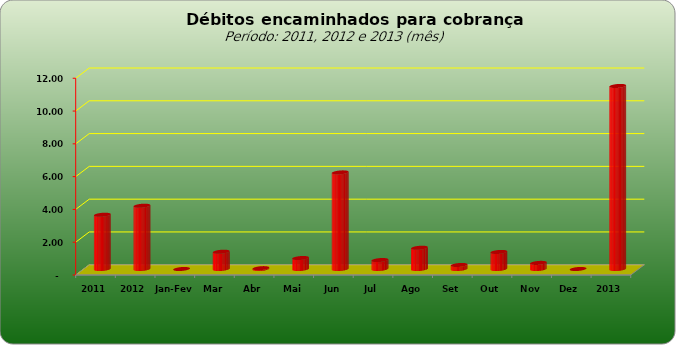
| Category |  3.309.443,02   3.859.728,44   -     1.053.903,71   50.529,60   669.296,13   5.890.806,29   546.448,11   1.296.316,32   245.030,62   1.039.828,93   372.068,71   -     11.164.228,42  |
|---|---|
| 2011 | 3309443.02 |
| 2012 | 3859728.44 |
| Jan-Fev | 0 |
| Mar | 1053903.71 |
| Abr | 50529.6 |
| Mai | 669296.13 |
| Jun | 5890806.29 |
| Jul | 546448.11 |
| Ago | 1296316.32 |
| Set | 245030.62 |
| Out | 1039828.93 |
| Nov | 372068.71 |
| Dez | 0 |
| 2013 | 11164228.42 |